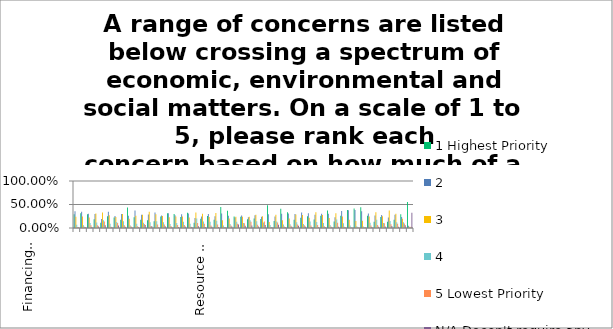
| Category | 1 Highest Priority | 2 | 3 | 4 | 5 Lowest Priority | N/A Doesn't require any attention |
|---|---|---|---|---|---|---|
| Financing for infrastructure (local sewer/water and roads) | 0.294 | 0.359 | 0.241 | 0.072 | 0.021 | 0.013 |
| Municipal financial stability (level of intergovernmental transfers and/or capacity of local tax base) | 0.315 | 0.346 | 0.244 | 0.056 | 0.025 | 0.015 |
| School closures - provincial funding formulas and Pupil Accommodation Review Process policies | 0.291 | 0.303 | 0.221 | 0.105 | 0.057 | 0.023 |
| Youth out-migration/retention | 0.185 | 0.298 | 0.308 | 0.118 | 0.06 | 0.03 |
| Newcomer attraction/retention - settlement integration | 0.114 | 0.193 | 0.331 | 0.167 | 0.139 | 0.056 |
| Labour force development - addressing workforce skills shortages | 0.249 | 0.346 | 0.269 | 0.091 | 0.028 | 0.016 |
| Improving public transportation services | 0.223 | 0.257 | 0.234 | 0.129 | 0.106 | 0.051 |
| Movement of goods: investment in rail, harbours, airports, highway infrastructure | 0.176 | 0.296 | 0.299 | 0.144 | 0.059 | 0.026 |
| Improved broadband services - higher speed, wider access | 0.434 | 0.261 | 0.196 | 0.059 | 0.036 | 0.015 |
| Youth employment/underemployment | 0.227 | 0.371 | 0.263 | 0.088 | 0.036 | 0.015 |
| Business ownership succession | 0.176 | 0.282 | 0.282 | 0.111 | 0.083 | 0.065 |
| Support for regional development - e.g. place-based development policy framework | 0.163 | 0.288 | 0.348 | 0.12 | 0.043 | 0.037 |
| Performance of key sectors - e.g manufacturing sector competitiveness/productivity | 0.145 | 0.328 | 0.295 | 0.143 | 0.076 | 0.013 |
| Impact of new provincial labour standards on SMEs - e.g. minimum wage increases | 0.246 | 0.268 | 0.254 | 0.123 | 0.074 | 0.036 |
| Support for primary industries e.g. mining, farming, forestry | 0.315 | 0.311 | 0.229 | 0.086 | 0.044 | 0.015 |
| Protection of ag. supply management in NAFTA trade negotiations | 0.297 | 0.271 | 0.243 | 0.104 | 0.066 | 0.02 |
| Success of international/inter-provincial trade deals - e.g. NAFTA | 0.233 | 0.295 | 0.243 | 0.134 | 0.066 | 0.03 |
| Developing local food systems | 0.326 | 0.308 | 0.226 | 0.09 | 0.028 | 0.023 |
| Tourism promotion | 0.11 | 0.212 | 0.33 | 0.204 | 0.108 | 0.036 |
| Species at risk/loss of biodiversity | 0.196 | 0.247 | 0.304 | 0.141 | 0.09 | 0.021 |
| Protecting parks and wilderness | 0.256 | 0.295 | 0.235 | 0.135 | 0.052 | 0.026 |
| Invasive species | 0.177 | 0.25 | 0.321 | 0.154 | 0.076 | 0.023 |
| Water quality in lakes, streams, rivers | 0.448 | 0.311 | 0.163 | 0.055 | 0.015 | 0.008 |
| Water quantity/supply for drinking, irrigation | 0.369 | 0.26 | 0.203 | 0.085 | 0.052 | 0.031 |
| Climate change - fossil fuel reduction | 0.242 | 0.223 | 0.237 | 0.131 | 0.09 | 0.077 |
| Climate change - adaptation | 0.237 | 0.267 | 0.24 | 0.105 | 0.102 | 0.048 |
| Nuclear energy and waste disposal | 0.184 | 0.227 | 0.239 | 0.165 | 0.132 | 0.053 |
| Resource management policies - e.g fracking, forestry management | 0.204 | 0.27 | 0.28 | 0.143 | 0.071 | 0.031 |
| Renewable energy production - e.g. wind, solar | 0.192 | 0.239 | 0.25 | 0.118 | 0.138 | 0.063 |
| Cost of energy | 0.482 | 0.294 | 0.129 | 0.065 | 0.015 | 0.015 |
| Cap and Trade Program - use of revenue from carbon reduction | 0.149 | 0.244 | 0.284 | 0.138 | 0.118 | 0.068 |
| Farmland loss/protection | 0.411 | 0.302 | 0.164 | 0.075 | 0.032 | 0.016 |
| Land use planning - growth and settlement policies, containing sprawl | 0.337 | 0.307 | 0.202 | 0.08 | 0.049 | 0.025 |
| Access to childcare | 0.173 | 0.3 | 0.286 | 0.12 | 0.073 | 0.048 |
| Access to post-secondary education/training | 0.216 | 0.329 | 0.278 | 0.085 | 0.061 | 0.031 |
| Housing affordability - housing quality | 0.251 | 0.315 | 0.219 | 0.137 | 0.056 | 0.023 |
| Homelessness and hidden homelessness | 0.181 | 0.279 | 0.333 | 0.126 | 0.064 | 0.016 |
| Poverty and/or income disparity | 0.261 | 0.302 | 0.278 | 0.105 | 0.036 | 0.018 |
| Food security | 0.375 | 0.303 | 0.214 | 0.062 | 0.03 | 0.016 |
| Crime - law enforcement | 0.136 | 0.23 | 0.316 | 0.18 | 0.112 | 0.026 |
| Addictions and/or mental illness | 0.259 | 0.36 | 0.246 | 0.098 | 0.025 | 0.012 |
| Long term care facilities - availability of beds in the region | 0.381 | 0.378 | 0.175 | 0.054 | 0.008 | 0.005 |
| Services for an aging population: home care/aging in place/care giver support | 0.414 | 0.382 | 0.148 | 0.039 | 0.015 | 0.003 |
| Access to quality medical services nearby | 0.442 | 0.357 | 0.153 | 0.029 | 0.008 | 0.01 |
| Health promotion, active living | 0.26 | 0.306 | 0.245 | 0.113 | 0.055 | 0.022 |
| Quality of recreation and cultural services - e.g. public libraries | 0.133 | 0.265 | 0.336 | 0.175 | 0.066 | 0.025 |
| Regional centralization of medical procedures - reduction in services in smaller hospitals | 0.236 | 0.277 | 0.249 | 0.105 | 0.102 | 0.031 |
| Volunteerism, capacity of non-profits | 0.132 | 0.224 | 0.37 | 0.15 | 0.081 | 0.044 |
| Civic engagement/health of democratic institutions | 0.173 | 0.28 | 0.305 | 0.125 | 0.088 | 0.028 |
| First Nations - improved health and social services, sanitation, education | 0.29 | 0.236 | 0.194 | 0.124 | 0.096 | 0.061 |
| Other - please explain below... | 0.552 | 0.048 | 0.028 | 0.021 | 0.028 | 0.324 |